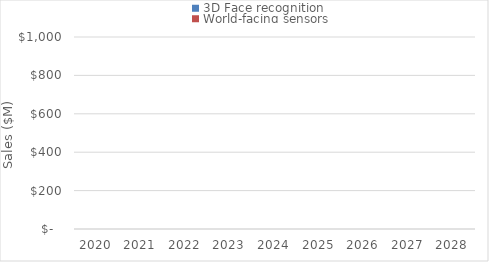
| Category | 3D Face recognition | World-facing sensors |
|---|---|---|
| 2020.0 | 0 | 0 |
| 2021.0 | 0 | 0 |
| 2022.0 | 0 | 0 |
| 2023.0 | 0 | 0 |
| 2024.0 | 0 | 0 |
| 2025.0 | 0 | 0 |
| 2026.0 | 0 | 0 |
| 2027.0 | 0 | 0 |
| 2028.0 | 0 | 0 |